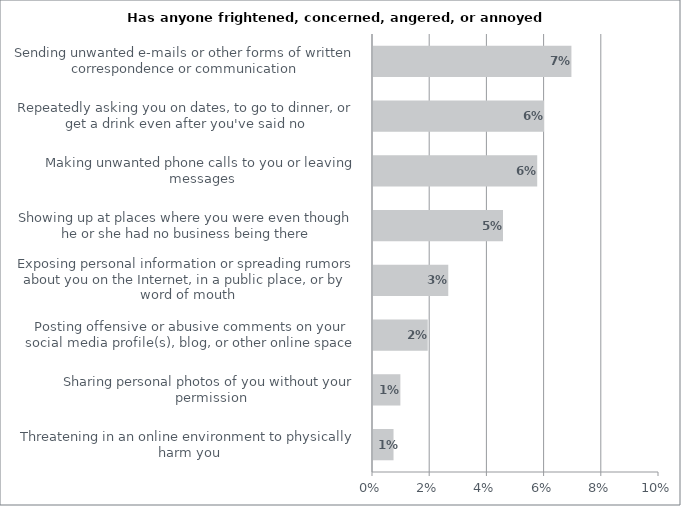
| Category | Series 0 |
|---|---|
| Threatening in an online environment to physically harm you | 0.007 |
| Sharing personal photos of you without your permission | 0.01 |
| Posting offensive or abusive comments on your social media profile(s), blog, or other online space | 0.019 |
| Exposing personal information or spreading rumors about you on the Internet, in a public place, or by word of mouth | 0.026 |
| Showing up at places where you were even though he or she had no business being there | 0.045 |
| Making unwanted phone calls to you or leaving messages | 0.057 |
| Repeatedly asking you on dates, to go to dinner, or get a drink even after you've said no | 0.06 |
| Sending unwanted e-mails or other forms of written correspondence or communication | 0.069 |